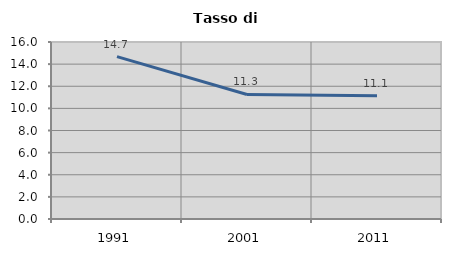
| Category | Tasso di disoccupazione   |
|---|---|
| 1991.0 | 14.681 |
| 2001.0 | 11.255 |
| 2011.0 | 11.15 |